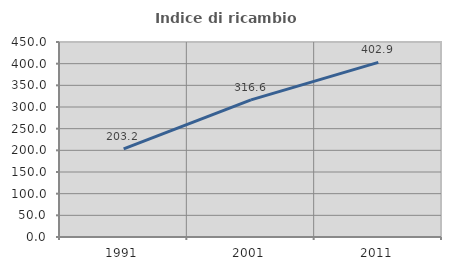
| Category | Indice di ricambio occupazionale  |
|---|---|
| 1991.0 | 203.175 |
| 2001.0 | 316.552 |
| 2011.0 | 402.878 |